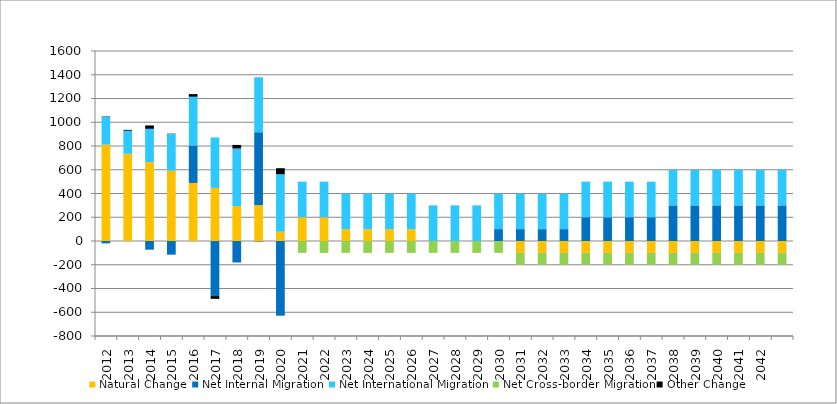
| Category | Natural Change | Net Internal Migration | Net International Migration | Net Cross-border Migration | Other Change |
|---|---|---|---|---|---|
| 2012.0 | 811 | -20 | 236 | 0 | 3 |
| 2013.0 | 734 | 1 | 194 | 0 | 7 |
| 2014.0 | 665 | -73 | 280 | 0 | 28 |
| 2015.0 | 592 | -115 | 311 | 0 | 2 |
| 2016.0 | 489 | 315 | 411 | 0 | 22 |
| 2017.0 | 447 | -464 | 425 | 0 | -23 |
| 2018.0 | 294 | -181 | 485 | 0 | 30 |
| 2019.0 | 302 | 614 | 463 | 0 | -2 |
| 2020.0 | 78 | -629 | 484 | 0 | 51 |
| 2021.0 | 200 | 0 | 300 | -100 | 0 |
| 2022.0 | 200 | 0 | 300 | -100 | 0 |
| 2023.0 | 100 | 0 | 300 | -100 | 0 |
| 2024.0 | 100 | 0 | 300 | -100 | 0 |
| 2025.0 | 100 | 0 | 300 | -100 | 0 |
| 2026.0 | 100 | 0 | 300 | -100 | 0 |
| 2027.0 | 0 | 0 | 300 | -100 | 0 |
| 2028.0 | 0 | 0 | 300 | -100 | 0 |
| 2029.0 | 0 | 0 | 300 | -100 | 0 |
| 2030.0 | 0 | 100 | 300 | -100 | 0 |
| 2031.0 | -100 | 100 | 300 | -100 | 0 |
| 2032.0 | -100 | 100 | 300 | -100 | 0 |
| 2033.0 | -100 | 100 | 300 | -100 | 0 |
| 2034.0 | -100 | 200 | 300 | -100 | 0 |
| 2035.0 | -100 | 200 | 300 | -100 | 0 |
| 2036.0 | -100 | 200 | 300 | -100 | 0 |
| 2037.0 | -100 | 200 | 300 | -100 | 0 |
| 2038.0 | -100 | 300 | 300 | -100 | 0 |
| 2039.0 | -100 | 300 | 300 | -100 | 0 |
| 2040.0 | -100 | 300 | 300 | -100 | 0 |
| 2041.0 | -100 | 300 | 300 | -100 | 0 |
| 2042.0 | -100 | 300 | 300 | -100 | 0 |